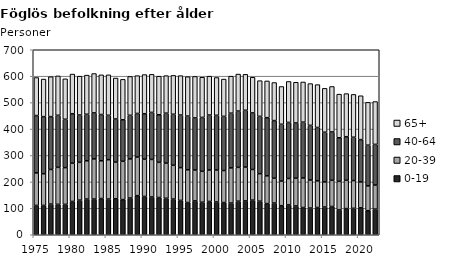
| Category | 0-19 | 20-39 | 40-64 | 65+ |
|---|---|---|---|---|
| 1975.0 | 111 | 123 | 217 | 144 |
| 1976.0 | 111 | 120 | 216 | 142 |
| 1977.0 | 116 | 131 | 200 | 151 |
| 1978.0 | 115 | 140 | 197 | 149 |
| 1979.0 | 115 | 139 | 183 | 153 |
| 1980.0 | 126 | 145 | 187 | 150 |
| 1981.0 | 131 | 143 | 179 | 147 |
| 1982.0 | 135 | 145 | 176 | 148 |
| 1983.0 | 135 | 152 | 174 | 149 |
| 1984.0 | 137 | 143 | 175 | 150 |
| 1985.0 | 135 | 149 | 168 | 153 |
| 1986.0 | 136 | 139 | 163 | 155 |
| 1987.0 | 133 | 145 | 157 | 153 |
| 1988.0 | 139 | 148 | 165 | 147 |
| 1989.0 | 148 | 146 | 165 | 143 |
| 1990.0 | 145 | 141 | 172 | 148 |
| 1991.0 | 143 | 142 | 178 | 144 |
| 1992.0 | 141 | 133 | 180 | 146 |
| 1993.0 | 138 | 133 | 189 | 142 |
| 1994.0 | 135 | 128 | 193 | 147 |
| 1995.0 | 130 | 124 | 199 | 149 |
| 1996.0 | 122 | 124 | 203 | 149 |
| 1997.0 | 128 | 117 | 197 | 157 |
| 1998.0 | 123 | 117 | 204 | 152 |
| 1999.0 | 126 | 119 | 208 | 147 |
| 2000.0 | 124 | 121 | 207 | 143 |
| 2001.0 | 122 | 121 | 205 | 141 |
| 2002.0 | 120 | 133 | 207 | 140 |
| 2003.0 | 127 | 128 | 213 | 140 |
| 2004.0 | 128 | 128 | 215 | 136 |
| 2005.0 | 131 | 116 | 214 | 135 |
| 2006.0 | 127 | 104 | 217 | 135 |
| 2007.0 | 118 | 105 | 220 | 139 |
| 2008.0 | 120 | 94 | 218 | 144 |
| 2009.0 | 110 | 93 | 215 | 143 |
| 2010.0 | 113 | 100 | 212 | 155 |
| 2011.0 | 109 | 105 | 209 | 154 |
| 2012.0 | 103 | 112 | 211 | 152 |
| 2013.0 | 101 | 106 | 207 | 158 |
| 2014.0 | 103 | 101 | 202 | 162 |
| 2015.0 | 105 | 95 | 188 | 166 |
| 2016.0 | 107 | 99 | 183 | 172 |
| 2017.0 | 94 | 108 | 165 | 165 |
| 2018.0 | 99 | 107 | 165 | 163 |
| 2019.0 | 100 | 105 | 164 | 162 |
| 2020.0 | 102 | 98 | 160 | 166 |
| 2021.0 | 91 | 94 | 154 | 162 |
| 2022.0 | 97 | 91 | 154 | 162 |